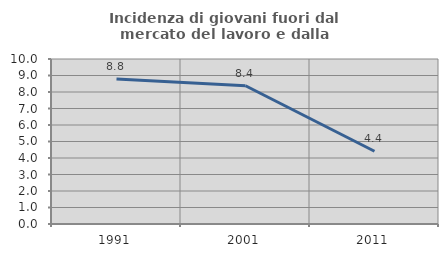
| Category | Incidenza di giovani fuori dal mercato del lavoro e dalla formazione  |
|---|---|
| 1991.0 | 8.789 |
| 2001.0 | 8.377 |
| 2011.0 | 4.408 |